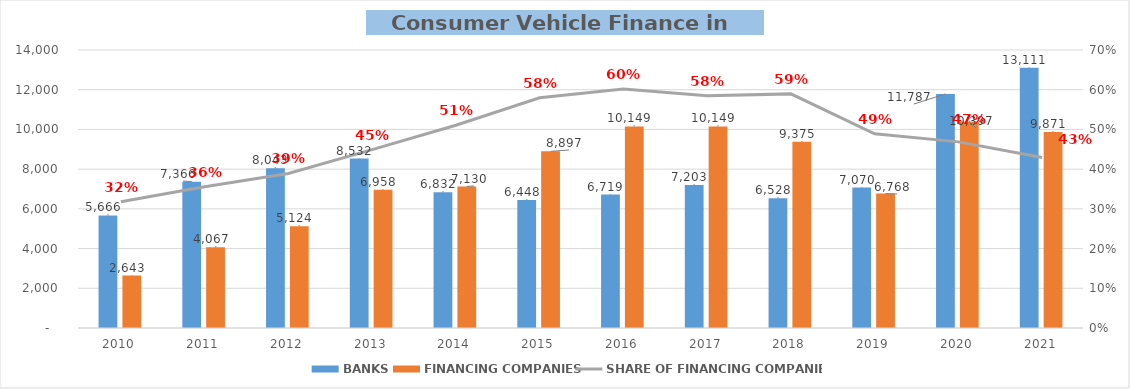
| Category | BANKS | FINANCING COMPANIES |
|---|---|---|
| 2010 | 5665.615 | 2643.169 |
| 2011 | 7366.42 | 4066.867 |
| 2012 | 8042.797 | 5124.261 |
| 2013 | 8531.566 | 6958.23 |
| 2014 | 6832.186 | 7129.957 |
| 2015 | 6447.808 | 8897.137 |
| 2016 | 6719.498 | 10148.982 |
| 2017 | 7202.608 | 10148.903 |
| 2018 | 6528.18 | 9375.099 |
| 2019 | 7070.3 | 6767.535 |
| 2020 | 11786.807 | 10397.228 |
| 2021 | 13111.088 | 9870.756 |